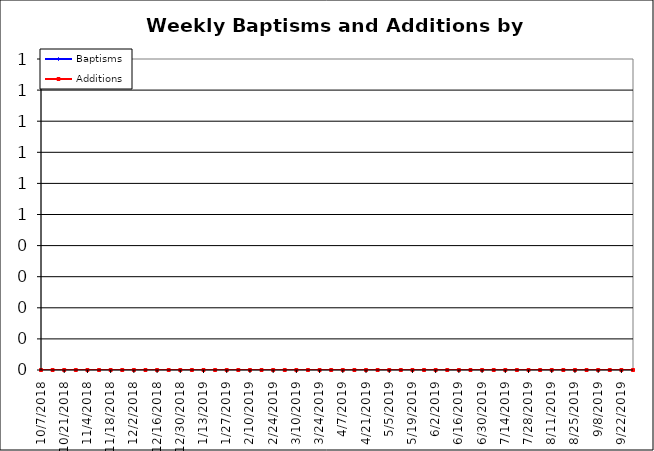
| Category | Baptisms | Additions |
|---|---|---|
| 10/7/18 | 0 | 0 |
| 10/14/18 | 0 | 0 |
| 10/21/18 | 0 | 0 |
| 10/28/18 | 0 | 0 |
| 11/4/18 | 0 | 0 |
| 11/11/18 | 0 | 0 |
| 11/18/18 | 0 | 0 |
| 11/25/18 | 0 | 0 |
| 12/2/18 | 0 | 0 |
| 12/9/18 | 0 | 0 |
| 12/16/18 | 0 | 0 |
| 12/23/18 | 0 | 0 |
| 12/30/18 | 0 | 0 |
| 1/6/19 | 0 | 0 |
| 1/13/19 | 0 | 0 |
| 1/20/19 | 0 | 0 |
| 1/27/19 | 0 | 0 |
| 2/3/19 | 0 | 0 |
| 2/10/19 | 0 | 0 |
| 2/17/19 | 0 | 0 |
| 2/24/19 | 0 | 0 |
| 3/3/19 | 0 | 0 |
| 3/10/19 | 0 | 0 |
| 3/17/19 | 0 | 0 |
| 3/24/19 | 0 | 0 |
| 3/31/19 | 0 | 0 |
| 4/7/19 | 0 | 0 |
| 4/14/19 | 0 | 0 |
| 4/21/19 | 0 | 0 |
| 4/28/19 | 0 | 0 |
| 5/5/19 | 0 | 0 |
| 5/12/19 | 0 | 0 |
| 5/19/19 | 0 | 0 |
| 5/26/19 | 0 | 0 |
| 6/2/19 | 0 | 0 |
| 6/9/19 | 0 | 0 |
| 6/16/19 | 0 | 0 |
| 6/23/19 | 0 | 0 |
| 6/30/19 | 0 | 0 |
| 7/7/19 | 0 | 0 |
| 7/14/19 | 0 | 0 |
| 7/21/19 | 0 | 0 |
| 7/28/19 | 0 | 0 |
| 8/4/19 | 0 | 0 |
| 8/11/19 | 0 | 0 |
| 8/18/19 | 0 | 0 |
| 8/25/19 | 0 | 0 |
| 9/1/19 | 0 | 0 |
| 9/8/19 | 0 | 0 |
| 9/15/19 | 0 | 0 |
| 9/22/19 | 0 | 0 |
| 9/29/19 | 0 | 0 |